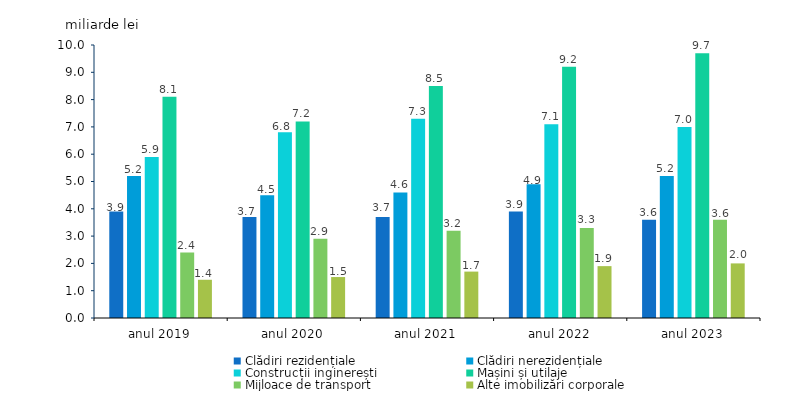
| Category | Clădiri rezidențiale | Clădiri nerezidențiale | Construcții inginerești | Mașini și utilaje | Mijloace de transport | Alte imobilizări corporale |
|---|---|---|---|---|---|---|
| anul 2019 | 3.9 | 5.2 | 5.9 | 8.1 | 2.4 | 1.4 |
| anul 2020 | 3.7 | 4.5 | 6.8 | 7.2 | 2.9 | 1.5 |
| anul 2021 | 3.7 | 4.6 | 7.3 | 8.5 | 3.2 | 1.7 |
| anul 2022 | 3.9 | 4.9 | 7.1 | 9.2 | 3.3 | 1.9 |
| anul 2023 | 3.6 | 5.2 | 7 | 9.7 | 3.6 | 2 |